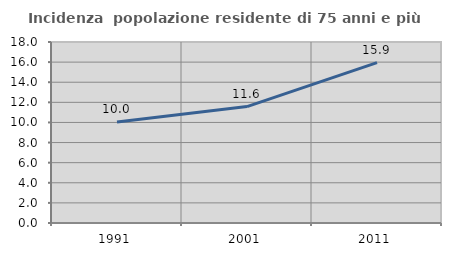
| Category | Incidenza  popolazione residente di 75 anni e più |
|---|---|
| 1991.0 | 10.038 |
| 2001.0 | 11.576 |
| 2011.0 | 15.943 |